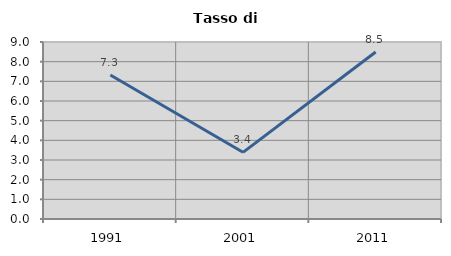
| Category | Tasso di disoccupazione   |
|---|---|
| 1991.0 | 7.324 |
| 2001.0 | 3.39 |
| 2011.0 | 8.489 |